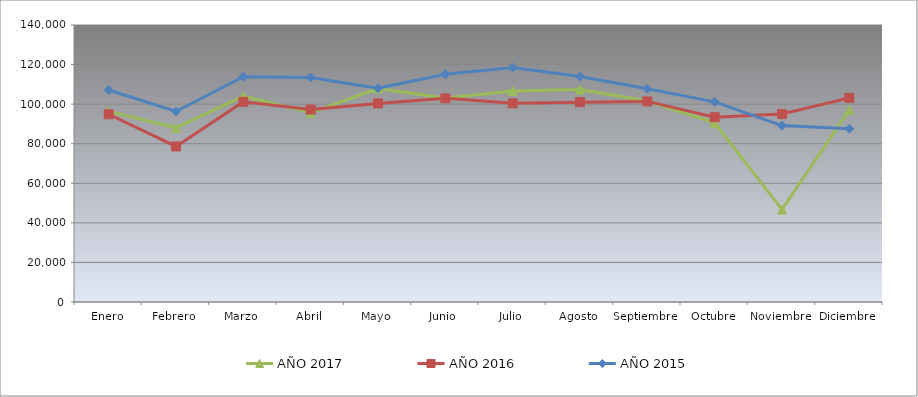
| Category | AÑO 2017 | AÑO 2016 | AÑO 2015 |
|---|---|---|---|
| Enero | 96328.589 | 94890.635 | 107140.19 |
| Febrero | 88029.287 | 78610.985 | 96294.509 |
| Marzo | 104017.434 | 101156.517 | 113854.182 |
| Abril | 95638.191 | 97270.36 | 113446.833 |
| Mayo | 107876.392 | 100377.83 | 108005.807 |
| Junio | 103152.621 | 102946.769 | 115112.601 |
| Julio | 106691.815 | 100421.495 | 118495.057 |
| Agosto | 107338.608 | 101010.968 | 113941.471 |
| Septiembre | 101575.608 | 101389.395 | 107794.858 |
| Octubre | 90580.123 | 93376.926 | 101146.333 |
| Noviembre | 46721.727 | 94985.242 | 89144.071 |
| Diciembre | 97142.531 | 103186.925 | 87601.962 |